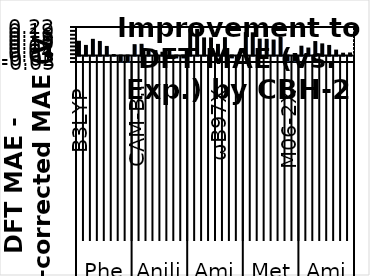
| Category | Series 0 |
|---|---|
| 0 | 0.106 |
| 1 | 0.074 |
| 2 | 0.121 |
| 3 | 0.105 |
| 4 | 0.066 |
| 5 | 0.004 |
| 6 | -0.045 |
| 7 | -0.047 |
| 8 | 0.08 |
| 9 | 0.083 |
| 10 | 0.033 |
| 11 | 0.034 |
| 12 | 0.021 |
| 13 | 0.033 |
| 14 | -0.014 |
| 15 | -0.014 |
| 16 | 0.2 |
| 17 | 0.198 |
| 18 | 0.132 |
| 19 | 0.132 |
| 20 | 0.082 |
| 21 | 0.134 |
| 22 | -0.014 |
| 23 | -0.014 |
| 24 | 0.173 |
| 25 | 0.171 |
| 26 | 0.123 |
| 27 | 0.121 |
| 28 | 0.116 |
| 29 | 0.137 |
| 30 | -0.039 |
| 31 | -0.039 |
| 32 | 0.068 |
| 33 | 0.054 |
| 34 | 0.104 |
| 35 | 0.086 |
| 36 | 0.074 |
| 37 | 0.038 |
| 38 | 0.014 |
| 39 | 0.016 |